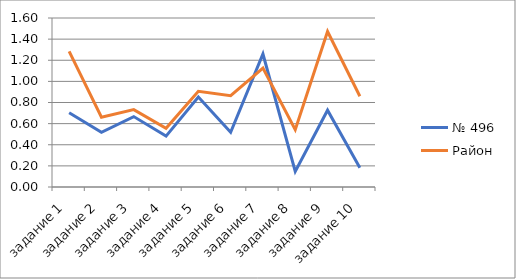
| Category | № 496 | Район  |
|---|---|---|
| задание 1 | 0.704 | 1.284 |
| задание 2 | 0.519 | 0.661 |
| задание 3 | 0.667 | 0.733 |
| задание 4 | 0.481 | 0.555 |
| задание 5 | 0.852 | 0.906 |
| задание 6 | 0.519 | 0.865 |
| задание 7 | 1.259 | 1.127 |
| задание 8 | 0.148 | 0.543 |
| задание 9 | 0.727 | 1.472 |
| задание 10 | 0.182 | 0.859 |